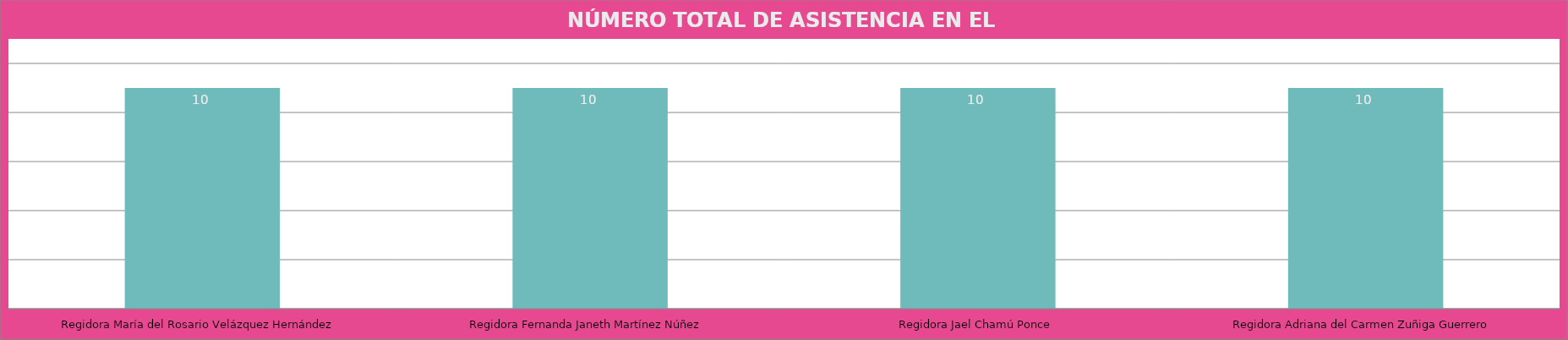
| Category | Regidora María del Rosario Velázquez Hernández |
|---|---|
| Regidora María del Rosario Velázquez Hernández | 10 |
| Regidora Fernanda Janeth Martínez Núñez | 10 |
| Regidora Jael Chamú Ponce | 10 |
| Regidora Adriana del Carmen Zuñiga Guerrero | 10 |